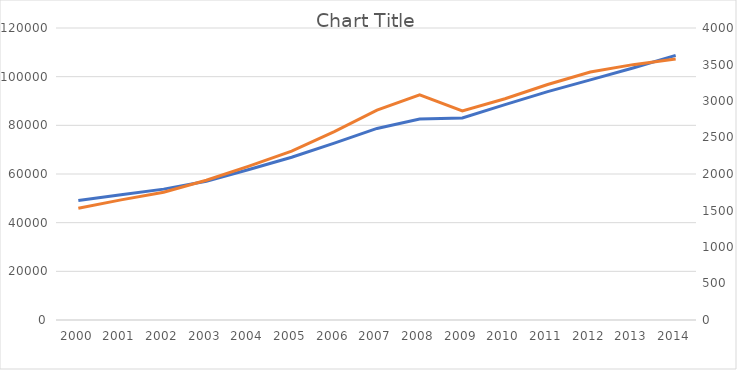
| Category | Series 0 |
|---|---|
| 2000.0 | 49136.53 |
| 2001.0 | 51480.93 |
| 2002.0 | 53786.63 |
| 2003.0 | 57022.33 |
| 2004.0 | 61836.829 |
| 2005.0 | 66869.929 |
| 2006.0 | 72662.13 |
| 2007.0 | 78731.133 |
| 2008.0 | 82631.636 |
| 2009.0 | 83031.735 |
| 2010.0 | 88509.634 |
| 2011.0 | 93868.038 |
| 2012.0 | 98698.339 |
| 2013.0 | 103537.94 |
| 2014.0 | 108760.84 |